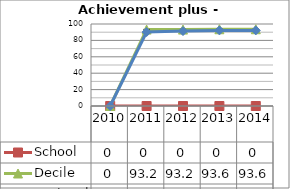
| Category | School  | Decile | National |
|---|---|---|---|
| 2010.0 | 0 | 0 | 0 |
| 2011.0 | 0 | 93.2 | 90.2 |
| 2012.0 | 0 | 93.2 | 91.4 |
| 2013.0 | 0 | 93.6 | 92.2 |
| 2014.0 | 0 | 93.6 | 92.2 |